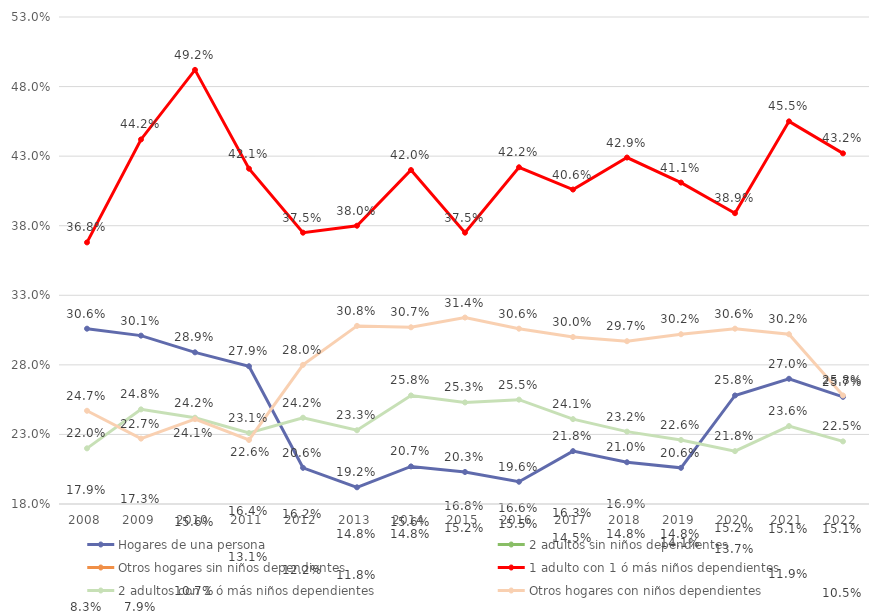
| Category | Hogares de una persona | 2 adultos sin niños dependientes | Otros hogares sin niños dependientes | 1 adulto con 1 ó más niños dependientes | 2 adultos con 1 ó más niños dependientes | Otros hogares con niños dependientes |
|---|---|---|---|---|---|---|
| 2008.0 | 0.306 | 0.179 | 0.083 | 0.368 | 0.22 | 0.247 |
| 2009.0 | 0.301 | 0.173 | 0.079 | 0.442 | 0.248 | 0.227 |
| 2010.0 | 0.289 | 0.156 | 0.107 | 0.492 | 0.242 | 0.241 |
| 2011.0 | 0.279 | 0.164 | 0.131 | 0.421 | 0.231 | 0.226 |
| 2012.0 | 0.206 | 0.162 | 0.122 | 0.375 | 0.242 | 0.28 |
| 2013.0 | 0.192 | 0.148 | 0.118 | 0.38 | 0.233 | 0.308 |
| 2014.0 | 0.207 | 0.148 | 0.156 | 0.42 | 0.258 | 0.307 |
| 2015.0 | 0.203 | 0.152 | 0.168 | 0.375 | 0.253 | 0.314 |
| 2016.0 | 0.196 | 0.166 | 0.155 | 0.422 | 0.255 | 0.306 |
| 2017.0 | 0.218 | 0.163 | 0.145 | 0.406 | 0.241 | 0.3 |
| 2018.0 | 0.21 | 0.169 | 0.148 | 0.429 | 0.232 | 0.297 |
| 2019.0 | 0.206 | 0.148 | 0.141 | 0.411 | 0.226 | 0.302 |
| 2020.0 | 0.258 | 0.152 | 0.137 | 0.389 | 0.218 | 0.306 |
| 2021.0 | 0.27 | 0.151 | 0.119 | 0.455 | 0.236 | 0.302 |
| 2022.0 | 0.257 | 0.151 | 0.105 | 0.432 | 0.225 | 0.258 |